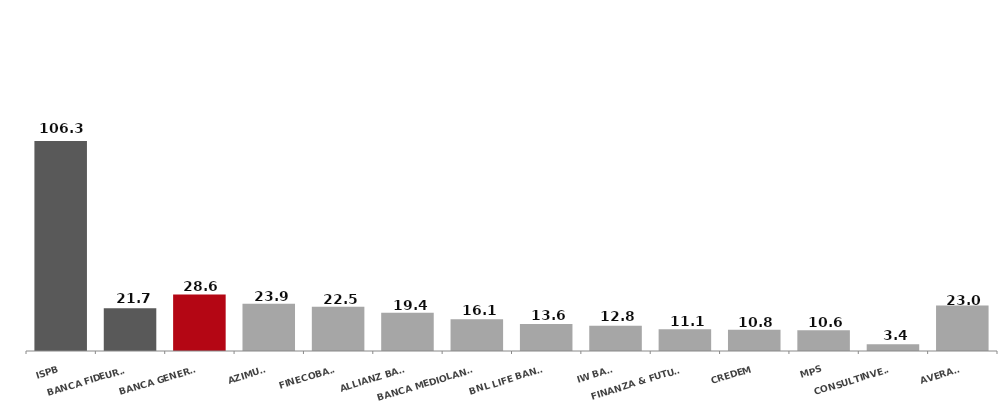
| Category | Series 0 |
|---|---|
| ISPB | 106.35 |
| BANCA FIDEURAM | 21.704 |
| BANCA GENERALI | 28.579 |
| AZIMUT  | 23.916 |
| FINECOBANK | 22.467 |
| ALLIANZ BANK | 19.427 |
| BANCA MEDIOLANUM | 16.078 |
| BNL LIFE BANKER | 13.608 |
| IW BANK | 12.787 |
| FINANZA & FUTURO | 11.063 |
| CREDEM | 10.822 |
| MPS | 10.557 |
| CONSULTINVEST | 3.359 |
| AVERAGE | 22.987 |